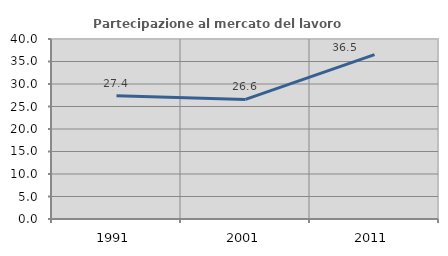
| Category | Partecipazione al mercato del lavoro  femminile |
|---|---|
| 1991.0 | 27.416 |
| 2001.0 | 26.566 |
| 2011.0 | 36.524 |